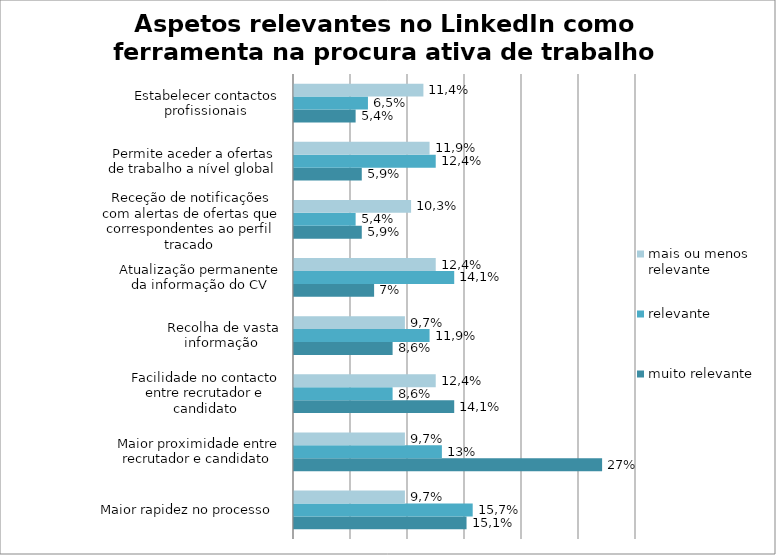
| Category | muito relevante | relevante | mais ou menos relevante |
|---|---|---|---|
| Maior rapidez no processo  | 15.135 | 15.676 | 9.73 |
| Maior proximidade entre recrutador e candidato | 27.027 | 12.973 | 9.73 |
| Facilidade no contacto entre recrutador e candidato | 14.054 | 8.649 | 12.432 |
| Recolha de vasta informação  | 8.649 | 11.892 | 9.73 |
| Atualização permanente da informação do CV | 7.027 | 14.054 | 12.432 |
| Receção de notificações com alertas de ofertas que correspondentes ao perfil traçado  | 5.946 | 5.405 | 10.27 |
| Permite aceder a ofertas de trabalho a nível global  | 5.946 | 12.432 | 11.892 |
| Estabelecer contactos profissionais  | 5.405 | 6.486 | 11.351 |